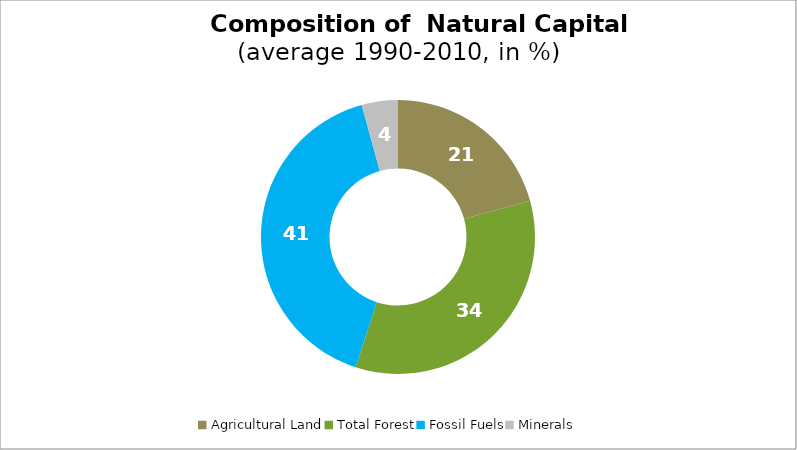
| Category | Series 0 |
|---|---|
| Agricultural Land | 20.725 |
| Total Forest | 34.285 |
| Fossil Fuels | 40.715 |
| Minerals | 4.274 |